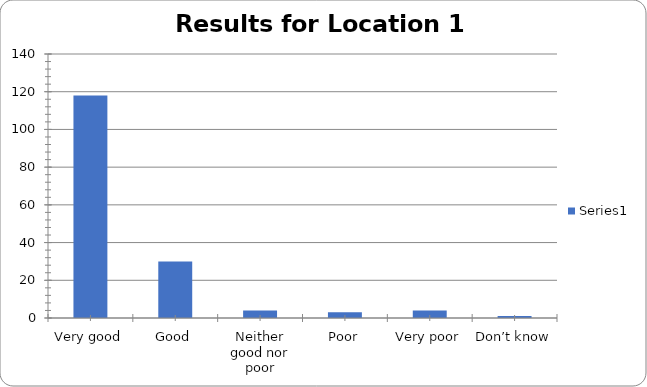
| Category | Series 0 |
|---|---|
| Very good | 118 |
| Good | 30 |
| Neither good nor poor | 4 |
| Poor | 3 |
| Very poor | 4 |
| Don’t know | 1 |